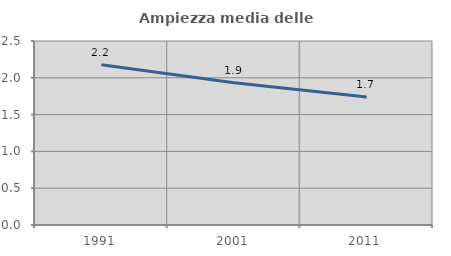
| Category | Ampiezza media delle famiglie |
|---|---|
| 1991.0 | 2.178 |
| 2001.0 | 1.931 |
| 2011.0 | 1.739 |